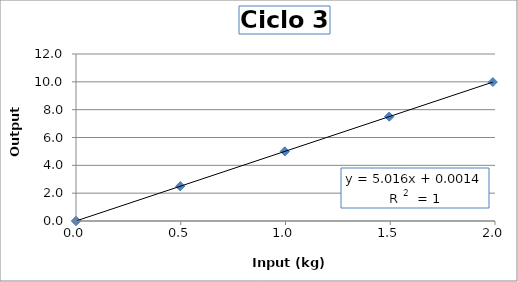
| Category | Ciclo 3 |
|---|---|
| 0.0 | 0 |
| 0.49760000000000004 | 2.496 |
| 0.9967999999999999 | 5 |
| 1.495 | 7.5 |
| 1.9898 | 9.983 |
| 1.495 | 7.5 |
| 0.9967999999999999 | 5.001 |
| 0.4976 | 2.501 |
| 0.0 | 0.002 |